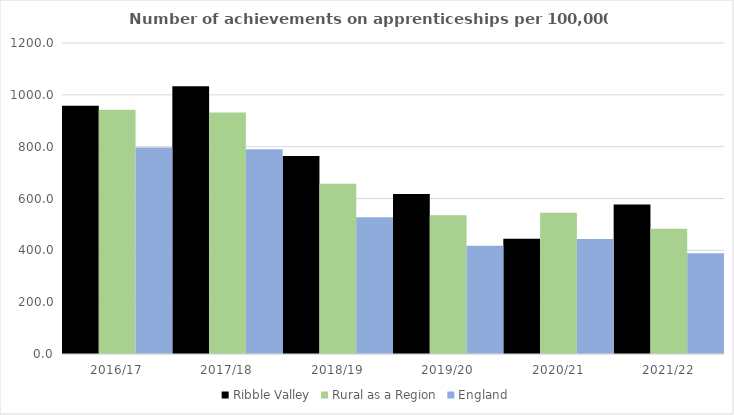
| Category | Ribble Valley | Rural as a Region | England |
|---|---|---|---|
| 2016/17 | 958 | 942.594 | 797 |
| 2017/18 | 1033 | 931.709 | 790 |
| 2018/19 | 764 | 656.44 | 528 |
| 2019/20 | 617 | 535.552 | 418 |
| 2020/21 | 445 | 545.333 | 444 |
| 2021/22 | 577 | 482.936 | 389 |